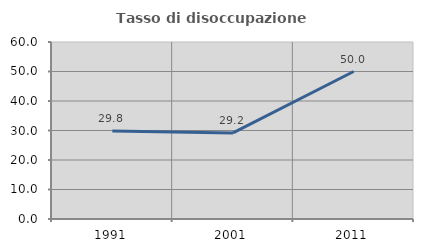
| Category | Tasso di disoccupazione giovanile  |
|---|---|
| 1991.0 | 29.825 |
| 2001.0 | 29.167 |
| 2011.0 | 50 |